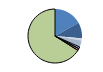
| Category | Series 0 |
|---|---|
| ARRASTRE | 103 |
| CERCO | 58 |
| ATUNEROS CAÑEROS | 0 |
| PALANGRE DE FONDO | 8 |
| PALANGRE DE SUPERFICIE | 22 |
| RASCO | 2 |
| VOLANTA | 7 |
| ARTES FIJAS | 7 |
| ARTES MENORES | 403 |